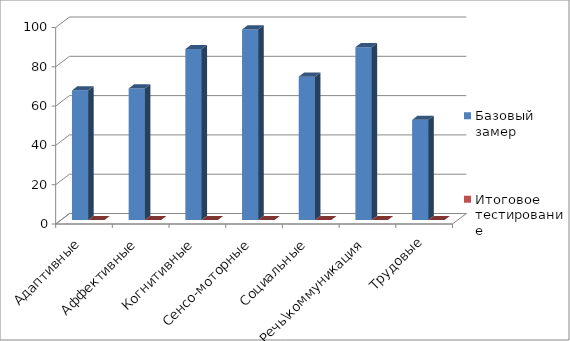
| Category | Базовый замер | Итоговое тестирование |
|---|---|---|
| Адаптивные | 66 | 0 |
| Аффективные | 67 | 0 |
| Когнитивные | 87 | 0 |
| Сенсо-моторные | 97 | 0 |
| Социальные | 73 | 0 |
| Речь\коммуникация | 88 | 0 |
| Трудовые | 51 | 0 |